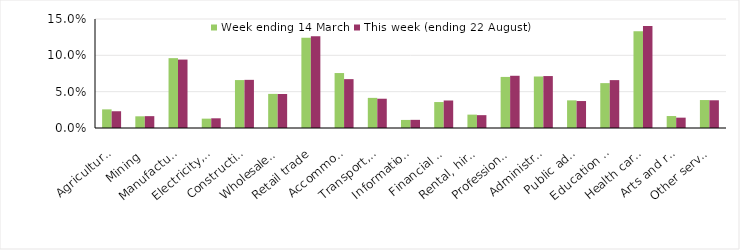
| Category | Week ending 14 March | This week (ending 22 August) |
|---|---|---|
| Agriculture, forestry and fishing | 0.026 | 0.023 |
| Mining | 0.016 | 0.016 |
| Manufacturing | 0.096 | 0.094 |
| Electricity, gas, water and waste services | 0.013 | 0.013 |
| Construction | 0.066 | 0.066 |
| Wholesale trade | 0.047 | 0.047 |
| Retail trade | 0.124 | 0.126 |
| Accommodation and food services | 0.076 | 0.067 |
| Transport, postal and warehousing | 0.041 | 0.04 |
| Information media and telecommunications | 0.011 | 0.011 |
| Financial and insurance services | 0.036 | 0.038 |
| Rental, hiring and real estate services | 0.018 | 0.018 |
| Professional, scientific and technical services | 0.07 | 0.072 |
| Administrative and support services | 0.071 | 0.071 |
| Public administration and safety | 0.038 | 0.037 |
| Education and training | 0.062 | 0.066 |
| Health care and social assistance | 0.133 | 0.14 |
| Arts and recreation services | 0.016 | 0.014 |
| Other services | 0.038 | 0.038 |